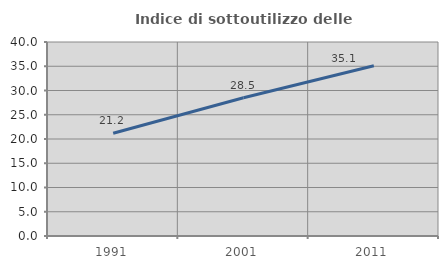
| Category | Indice di sottoutilizzo delle abitazioni  |
|---|---|
| 1991.0 | 21.195 |
| 2001.0 | 28.508 |
| 2011.0 | 35.105 |